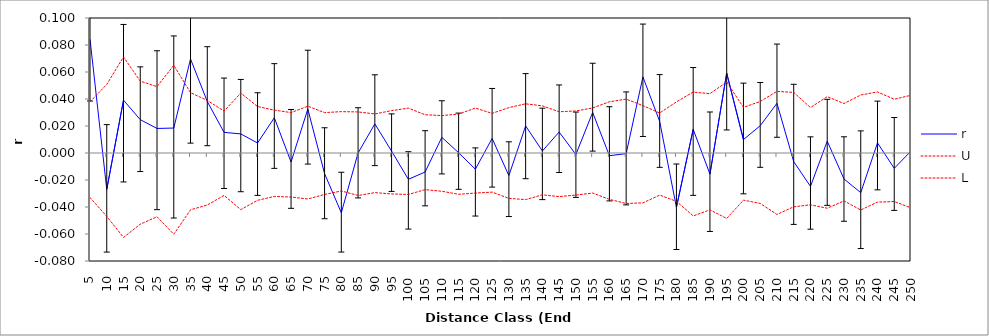
| Category | r | U | L |
|---|---|---|---|
| 5.0 | 0.084 | 0.038 | -0.033 |
| 10.0 | -0.027 | 0.051 | -0.047 |
| 15.0 | 0.039 | 0.071 | -0.063 |
| 20.0 | 0.025 | 0.053 | -0.053 |
| 25.0 | 0.018 | 0.049 | -0.047 |
| 30.0 | 0.018 | 0.065 | -0.06 |
| 35.0 | 0.07 | 0.045 | -0.042 |
| 40.0 | 0.038 | 0.039 | -0.039 |
| 45.0 | 0.015 | 0.031 | -0.031 |
| 50.0 | 0.014 | 0.044 | -0.042 |
| 55.0 | 0.007 | 0.034 | -0.035 |
| 60.0 | 0.026 | 0.032 | -0.032 |
| 65.0 | -0.007 | 0.03 | -0.033 |
| 70.0 | 0.033 | 0.035 | -0.034 |
| 75.0 | -0.015 | 0.03 | -0.031 |
| 80.0 | -0.044 | 0.031 | -0.028 |
| 85.0 | 0 | 0.03 | -0.031 |
| 90.0 | 0.022 | 0.029 | -0.029 |
| 95.0 | 0.001 | 0.031 | -0.03 |
| 100.0 | -0.019 | 0.033 | -0.031 |
| 105.0 | -0.014 | 0.028 | -0.027 |
| 110.0 | 0.012 | 0.028 | -0.028 |
| 115.0 | 0 | 0.029 | -0.031 |
| 120.0 | -0.012 | 0.033 | -0.03 |
| 125.0 | 0.011 | 0.029 | -0.029 |
| 130.0 | -0.017 | 0.034 | -0.034 |
| 135.0 | 0.02 | 0.036 | -0.035 |
| 140.0 | 0.001 | 0.035 | -0.031 |
| 145.0 | 0.016 | 0.031 | -0.032 |
| 150.0 | -0.001 | 0.031 | -0.031 |
| 155.0 | 0.03 | 0.033 | -0.03 |
| 160.0 | -0.002 | 0.038 | -0.034 |
| 165.0 | 0 | 0.04 | -0.037 |
| 170.0 | 0.056 | 0.035 | -0.037 |
| 175.0 | 0.023 | 0.03 | -0.031 |
| 180.0 | -0.04 | 0.038 | -0.036 |
| 185.0 | 0.018 | 0.045 | -0.047 |
| 190.0 | -0.016 | 0.044 | -0.042 |
| 195.0 | 0.059 | 0.053 | -0.049 |
| 200.0 | 0.01 | 0.034 | -0.035 |
| 205.0 | 0.02 | 0.038 | -0.037 |
| 210.0 | 0.037 | 0.046 | -0.046 |
| 215.0 | -0.006 | 0.045 | -0.04 |
| 220.0 | -0.025 | 0.034 | -0.038 |
| 225.0 | 0.009 | 0.042 | -0.041 |
| 230.0 | -0.019 | 0.037 | -0.035 |
| 235.0 | -0.029 | 0.043 | -0.042 |
| 240.0 | 0.007 | 0.045 | -0.036 |
| 245.0 | -0.011 | 0.04 | -0.036 |
| 250.0 | 0.001 | 0.043 | -0.041 |